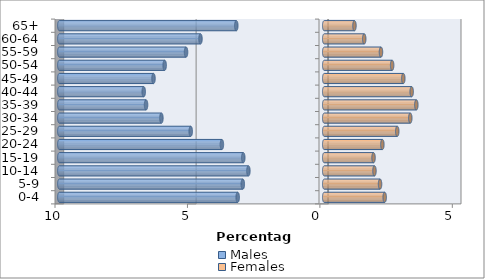
| Category | Males | Females |
|---|---|---|
| 0-4 | -3.267 | 2.283 |
| 5-9 | -3.073 | 2.107 |
| 10-14 | -2.863 | 1.897 |
| 15-19 | -3.056 | 1.862 |
| 20-24 | -3.864 | 2.195 |
| 25-29 | -5.04 | 2.757 |
| 30-34 | -6.147 | 3.249 |
| 35-39 | -6.726 | 3.477 |
| 40-44 | -6.814 | 3.302 |
| 45-49 | -6.445 | 2.986 |
| 50-54 | -6.024 | 2.564 |
| 55-59 | -5.216 | 2.143 |
| 60-64 | -4.672 | 1.51 |
| 65+ | -3.319 | 1.142 |